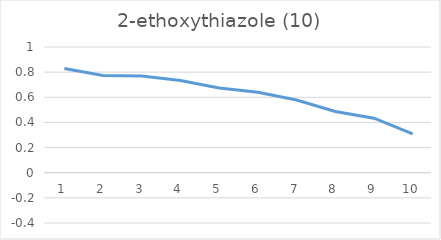
| Category | Series 0 |
|---|---|
| 0 | 0.829 |
| 1 | 0.774 |
| 2 | 0.77 |
| 3 | 0.734 |
| 4 | 0.674 |
| 5 | 0.64 |
| 6 | 0.579 |
| 7 | 0.488 |
| 8 | 0.434 |
| 9 | 0.309 |